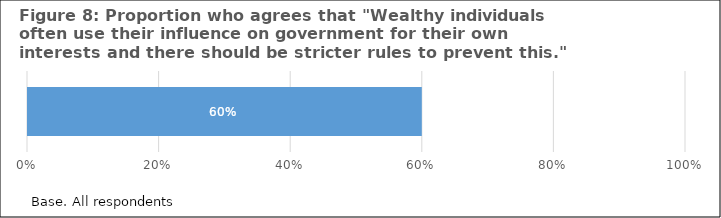
| Category | Series 0 |
|---|---|
| 0 | 0.6 |